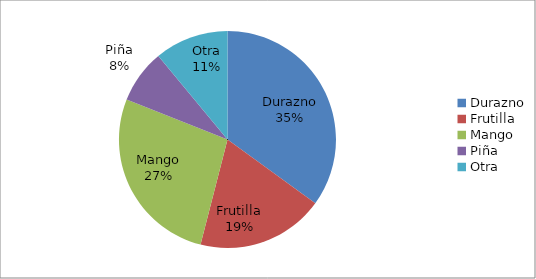
| Category | Series 0 |
|---|---|
| Durazno | 98 |
| Frutilla | 53.2 |
| Mango | 75.6 |
| Piña | 22.4 |
| Otra | 30.8 |